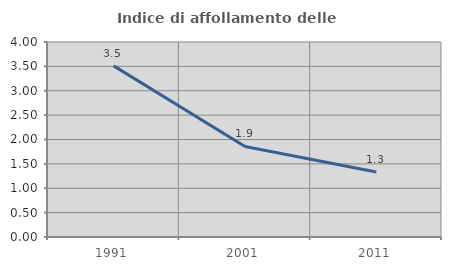
| Category | Indice di affollamento delle abitazioni  |
|---|---|
| 1991.0 | 3.51 |
| 2001.0 | 1.858 |
| 2011.0 | 1.332 |